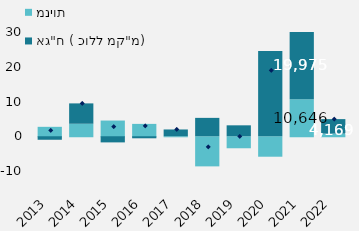
| Category | מניות | אג"ח ( כולל מק"מ) |
|---|---|---|
| 2013 | 2712 | -1011 |
| 2014 | 3600 | 5856 |
| 2015 | 4521 | -1767 |
| 2016 | 3560 | -589 |
| 2017 | -3 | 1951 |
| 2018 | -8380 | 5289 |
| 2019 | -3170 | 3144 |
| 2020 | -5603 | 24535 |
| 2021 | 10645.708 | 19975 |
| 2022 | 762 | 4169 |